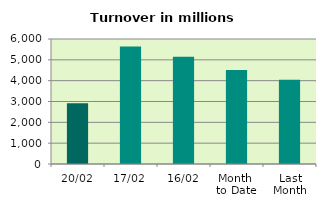
| Category | Series 0 |
|---|---|
| 20/02 | 2915.543 |
| 17/02 | 5642.142 |
| 16/02 | 5146.712 |
| Month 
to Date | 4509.978 |
| Last
Month | 4043.095 |